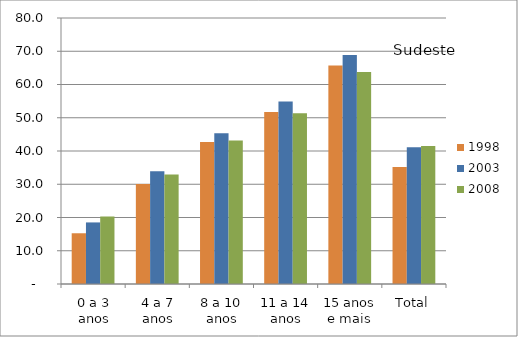
| Category | 1998 | 2003 | 2008 |
|---|---|---|---|
| 0 a 3 anos | 15.26 | 18.52 | 20.32 |
| 4 a 7 anos | 30.11 | 33.9 | 32.93 |
| 8 a 10 anos | 42.71 | 45.33 | 43.18 |
| 11 a 14 anos | 51.7 | 54.92 | 51.34 |
| 15 anos e mais | 65.72 | 68.89 | 63.76 |
| Total | 35.16 | 41.13 | 41.48 |